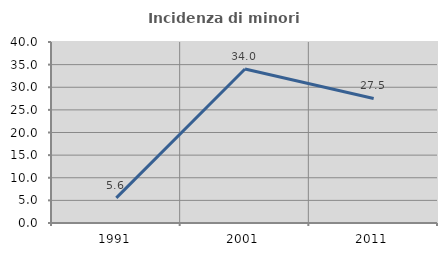
| Category | Incidenza di minori stranieri |
|---|---|
| 1991.0 | 5.556 |
| 2001.0 | 34.028 |
| 2011.0 | 27.53 |